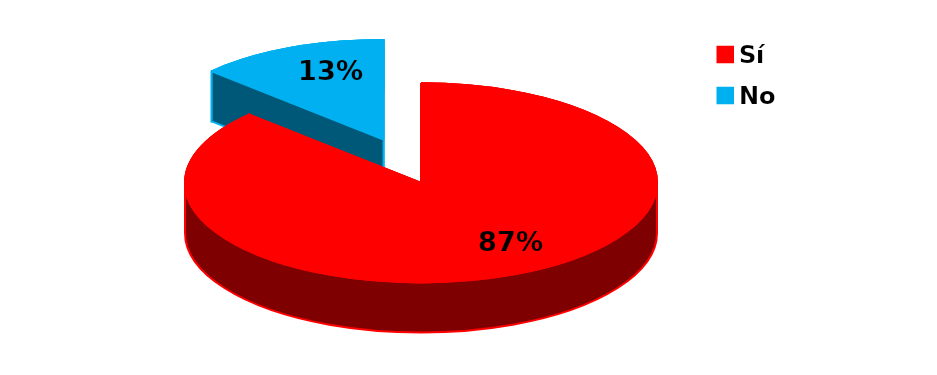
| Category | Series 0 |
|---|---|
| Sí | 429 |
| No | 64 |